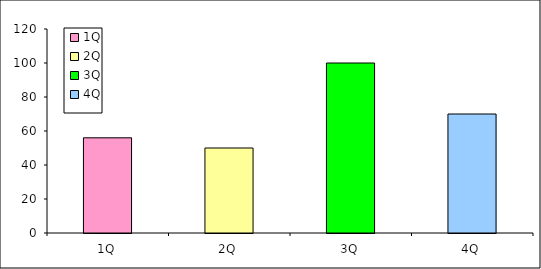
| Category | Plan |
|---|---|
| 1Q | 56 |
| 2Q | 50 |
| 3Q | 100 |
| 4Q | 70 |